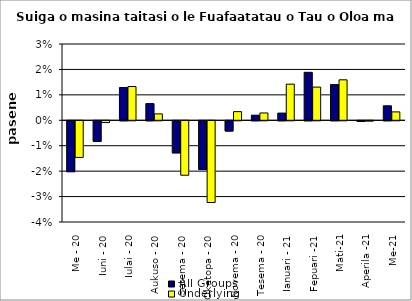
| Category | All Groups | Underlying |
|---|---|---|
| Me - 20 | -0.02 | -0.014 |
| Iuni - 20 | -0.008 | -0.001 |
| Iulai - 20 | 0.013 | 0.013 |
| Aukuso - 20 | 0.007 | 0.003 |
| Setema - 20 | -0.013 | -0.021 |
| Oketopa - 20 | -0.019 | -0.032 |
| Novema - 20 | -0.004 | 0.003 |
| Tesema - 20 | 0.002 | 0.003 |
| Ianuari - 21 | 0.003 | 0.014 |
| Fepuari -21 | 0.019 | 0.013 |
| Mati-21 | 0.014 | 0.016 |
| Aperila -21 | 0 | 0 |
| Me-21 | 0.006 | 0.003 |